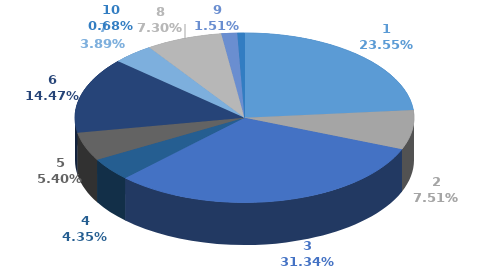
| Category | Series 0 |
|---|---|
| 0 | 345641 |
| 1 | 110246 |
| 2 | 460044 |
| 3 | 63872 |
| 4 | 79212 |
| 5 | 212374 |
| 6 | 57127 |
| 7 | 107143 |
| 8 | 22130 |
| 9 | 10000 |